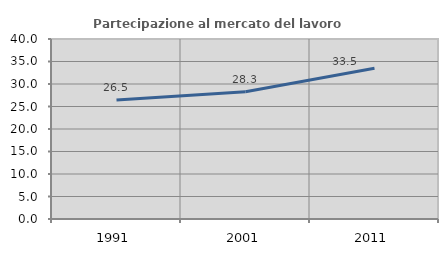
| Category | Partecipazione al mercato del lavoro  femminile |
|---|---|
| 1991.0 | 26.47 |
| 2001.0 | 28.276 |
| 2011.0 | 33.502 |